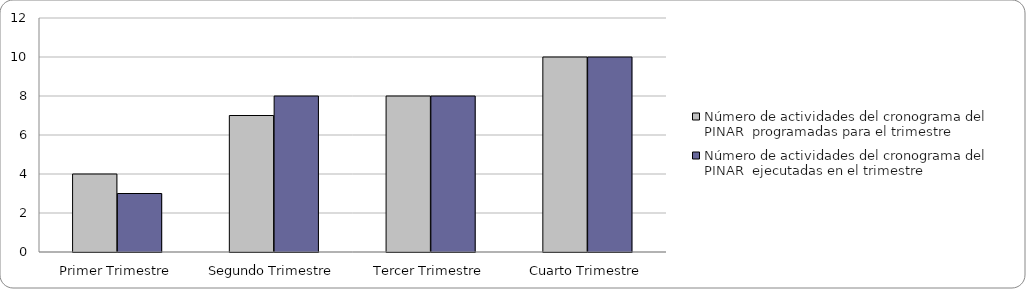
| Category | Número de actividades del cronograma del PINAR  programadas para el trimestre | Número de actividades del cronograma del PINAR  ejecutadas en el trimestre  |
|---|---|---|
| Primer Trimestre | 4 | 3 |
| Segundo Trimestre | 7 | 8 |
| Tercer Trimestre | 8 | 8 |
| Cuarto Trimestre | 10 | 10 |